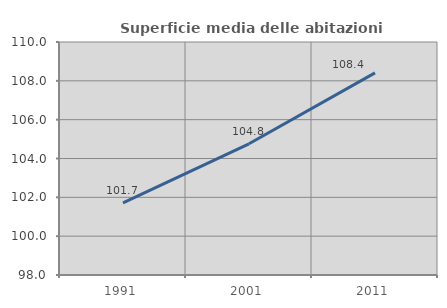
| Category | Superficie media delle abitazioni occupate |
|---|---|
| 1991.0 | 101.716 |
| 2001.0 | 104.758 |
| 2011.0 | 108.409 |